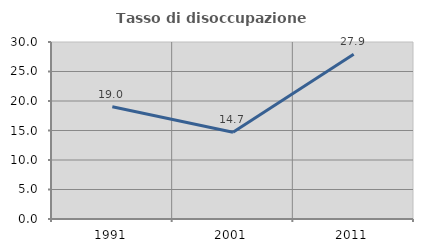
| Category | Tasso di disoccupazione giovanile  |
|---|---|
| 1991.0 | 19.014 |
| 2001.0 | 14.706 |
| 2011.0 | 27.925 |